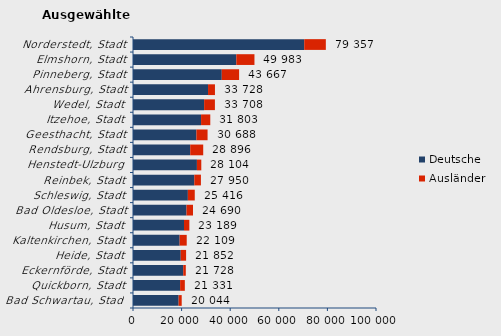
| Category | Deutsche | Ausländer | Series 2 |
|---|---|---|---|
| Bad Schwartau, Stadt | 18778 | 1266 | 20044 |
| Quickborn, Stadt | 19392 | 1939 | 21331 |
| Eckernförde, Stadt | 20665 | 1063 | 21728 |
| Heide, Stadt | 19641 | 2211 | 21852 |
| Kaltenkirchen, Stadt | 19191 | 2918 | 22109 |
| Husum, Stadt | 20992 | 2197 | 23189 |
| Bad Oldesloe, Stadt | 22012 | 2678 | 24690 |
| Schleswig, Stadt | 22581 | 2835 | 25416 |
| Reinbek, Stadt | 25230 | 2720 | 27950 |
| Henstedt-Ulzburg | 26306 | 1798 | 28104 |
| Rendsburg, Stadt | 23550 | 5346 | 28896 |
| Geesthacht, Stadt | 26097 | 4591 | 30688 |
| Itzehoe, Stadt | 28009 | 3794 | 31803 |
| Wedel, Stadt | 29272 | 4436 | 33708 |
| Ahrensburg, Stadt | 30876 | 2852 | 33728 |
| Pinneberg, Stadt | 36534 | 7133 | 43667 |
| Elmshorn, Stadt | 42519 | 7464 | 49983 |
| Norderstedt, Stadt | 70465 | 8892 | 79357 |